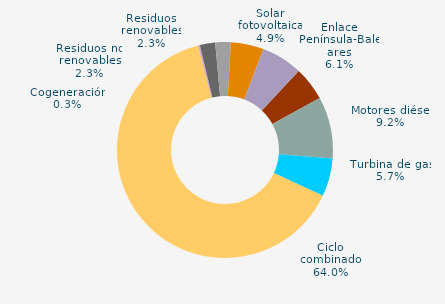
| Category | Series 0 |
|---|---|
| Carbón | 5.075 |
| Motores diésel | 9.227 |
| Turbina de gas | 5.732 |
| Ciclo combinado | 64.012 |
| Generación auxiliar | 0 |
| Cogeneración | 0.268 |
| Residuos no renovables | 2.296 |
| Residuos renovables | 2.296 |
| Eólica | 0.005 |
| Solar fotovoltaica | 4.937 |
| Otras renovables | 0.019 |
| Enlace Península-Baleares | 6.134 |